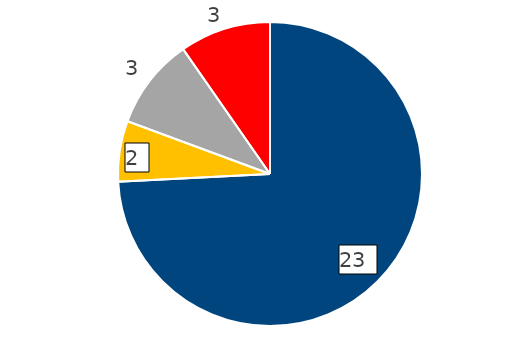
| Category | 2015 |
|---|---|
| E-mail a Transparencia CORREOS | 23 |
| Correo postal a Transparencia CORREOS | 2 |
| Portal Transparencia AGE | 3 |
| Registro general CORREOS | 3 |